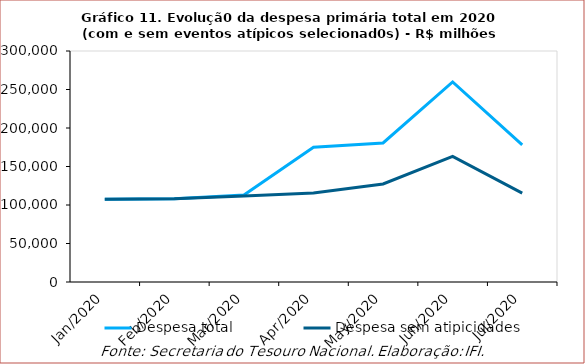
| Category | Despesa total | Despesa sem atipicidades |
|---|---|---|
| 2020-01-01 | 107561.998 | 107561.998 |
| 2020-02-01 | 108252.709 | 108252.578 |
| 2020-03-01 | 112885.32 | 111847.042 |
| 2020-04-01 | 175075.731 | 115670.328 |
| 2020-05-01 | 180629.946 | 127271.991 |
| 2020-06-01 | 259838.092 | 163017.2 |
| 2020-07-01 | 178089.158 | 115328.516 |